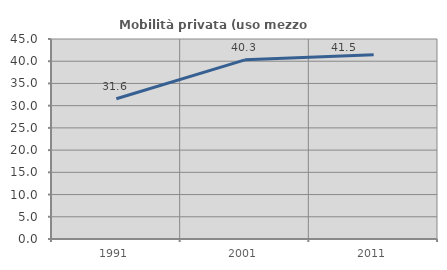
| Category | Mobilità privata (uso mezzo privato) |
|---|---|
| 1991.0 | 31.56 |
| 2001.0 | 40.315 |
| 2011.0 | 41.48 |